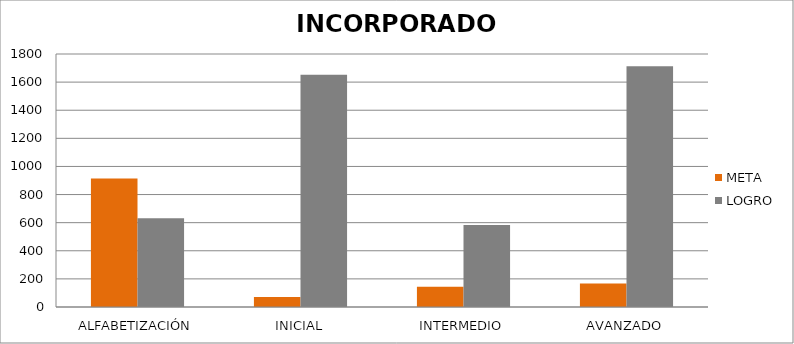
| Category | META | LOGRO |
|---|---|---|
| ALFABETIZACIÓN | 915 | 632 |
| INICIAL | 72 | 1652 |
| INTERMEDIO | 144 | 583 |
| AVANZADO | 168 | 1712 |